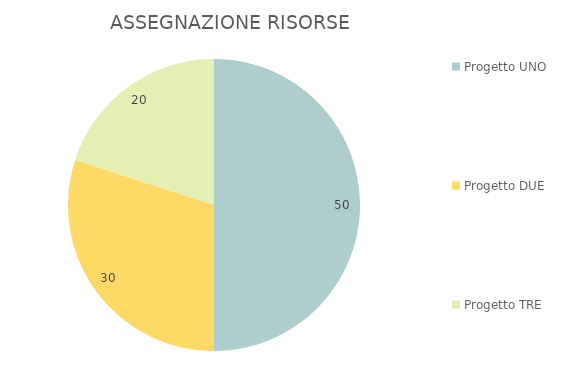
| Category | Series 0 |
|---|---|
| Progetto UNO | 50 |
| Progetto DUE | 30 |
| Progetto TRE | 20 |